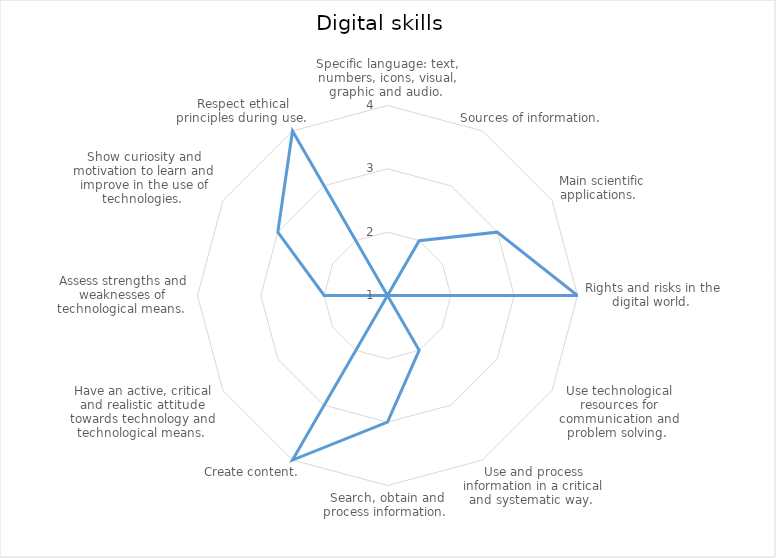
| Category | Series 0 |
|---|---|
| Specific language: text, numbers, icons, visual, graphic and audio.  | 1 |
| Sources of information.  | 2 |
| Main scientific applications.   | 3 |
| Rights and risks in the digital world.  | 4 |
| Use technological resources for communication and problem solving.  | 1 |
| Use and process information in a critical and systematic way.  | 2 |
| Search, obtain and process information.  | 3 |
| Create content.  | 4 |
| Have an active, critical and realistic attitude towards technology and technological means.  | 1 |
| Assess strengths and weaknesses of technological means.  | 2 |
| Show curiosity and motivation to learn and improve in the use of technologies.  | 3 |
| Respect ethical principles during use.  | 4 |